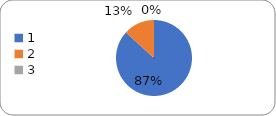
| Category | Series 0 |
|---|---|
| 0 | 85 |
| 1 | 13 |
| 2 | 0 |